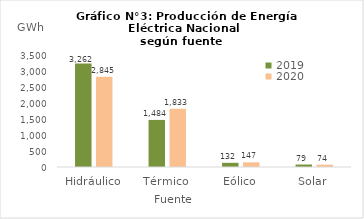
| Category | 2019 | 2020 |
|---|---|---|
| Hidráulico | 3262.456 | 2845.429 |
| Térmico | 1484.358 | 1832.803 |
| Eólico | 131.848 | 147.328 |
| Solar | 78.589 | 73.657 |